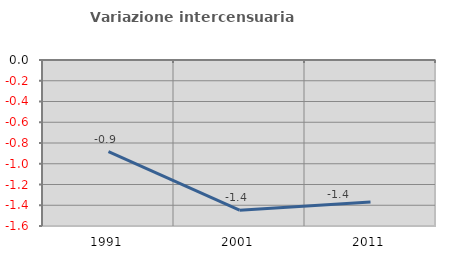
| Category | Variazione intercensuaria annua |
|---|---|
| 1991.0 | -0.884 |
| 2001.0 | -1.448 |
| 2011.0 | -1.368 |